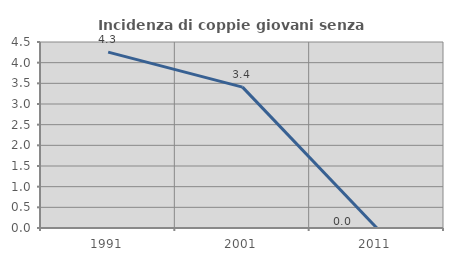
| Category | Incidenza di coppie giovani senza figli |
|---|---|
| 1991.0 | 4.255 |
| 2001.0 | 3.409 |
| 2011.0 | 0 |